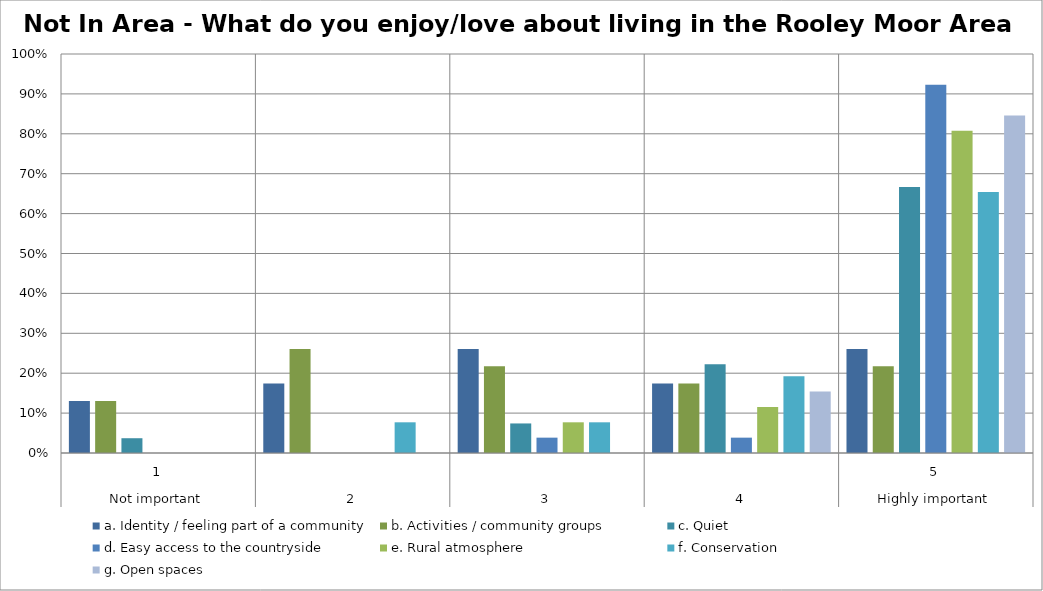
| Category | a. Identity / feeling part of a community | b. Activities / community groups | c. Quiet | d. Easy access to the countryside | e. Rural atmosphere | f. Conservation | g. Open spaces |
|---|---|---|---|---|---|---|---|
| 0 | 0.13 | 0.13 | 0.037 | 0 | 0 | 0 | 0 |
| 1 | 0.174 | 0.261 | 0 | 0 | 0 | 0.077 | 0 |
| 2 | 0.261 | 0.217 | 0.074 | 0.038 | 0.077 | 0.077 | 0 |
| 3 | 0.174 | 0.174 | 0.222 | 0.038 | 0.115 | 0.192 | 0.154 |
| 4 | 0.261 | 0.217 | 0.667 | 0.923 | 0.808 | 0.654 | 0.846 |